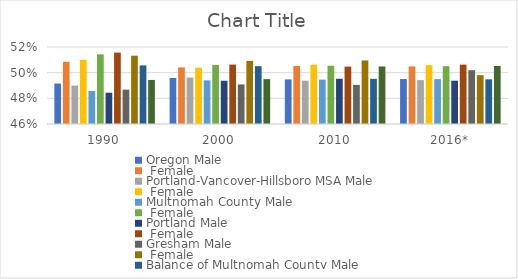
| Category | Oregon | Portland-Vancover-Hillsboro MSA | Multnomah County | Portland | Gresham | Balance of Multnomah County |
|---|---|---|---|---|---|---|
| 1990 | 0.508 | 0.51 | 0.514 | 0.516 | 0.513 | 0.494 |
| 2000 | 0.504 | 0.504 | 0.506 | 0.506 | 0.509 | 0.495 |
| 2010 | 0.505 | 0.506 | 0.505 | 0.505 | 0.51 | 0.505 |
| 2016* | 0.505 | 0.506 | 0.505 | 0.506 | 0.498 | 0.505 |